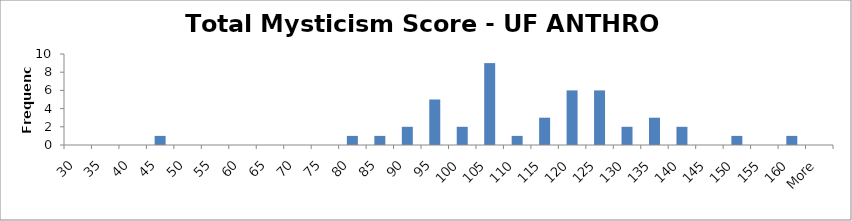
| Category | Frequency |
|---|---|
| 30 | 0 |
| 35 | 0 |
| 40 | 0 |
| 45 | 1 |
| 50 | 0 |
| 55 | 0 |
| 60 | 0 |
| 65 | 0 |
| 70 | 0 |
| 75 | 0 |
| 80 | 1 |
| 85 | 1 |
| 90 | 2 |
| 95 | 5 |
| 100 | 2 |
| 105 | 9 |
| 110 | 1 |
| 115 | 3 |
| 120 | 6 |
| 125 | 6 |
| 130 | 2 |
| 135 | 3 |
| 140 | 2 |
| 145 | 0 |
| 150 | 1 |
| 155 | 0 |
| 160 | 1 |
| More | 0 |